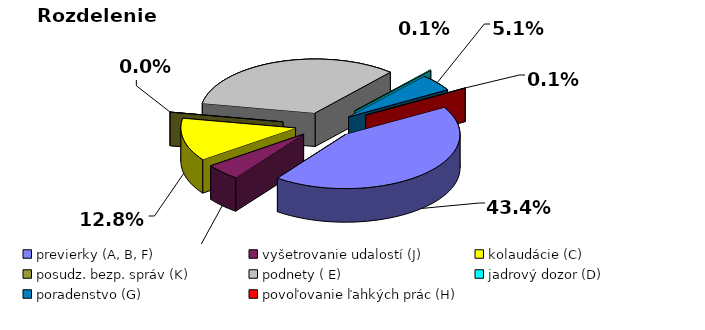
| Category | Series 0 |
|---|---|
| previerky (A, B, F) | 116535.93 |
| vyšetrovanie udalostí (J) | 13263.235 |
| kolaudácie (C) | 34482.435 |
| posudz. bezp. správ (K) | 15.2 |
| podnety ( E) | 89924.34 |
| jadrový dozor (D) | 390 |
| poradenstvo (G) | 13589.96 |
| povoľovanie ľahkých prác (H) | 188.1 |